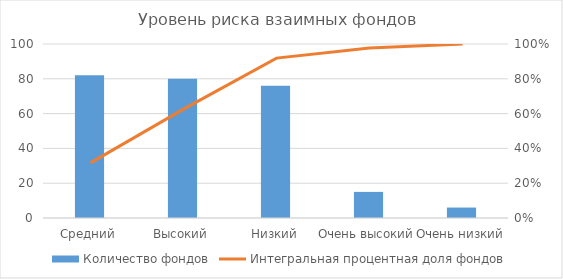
| Category | Количество фондов |
|---|---|
| Средний | 82 |
| Высокий | 80 |
| Низкий | 76 |
| Очень высокий | 15 |
| Очень низкий | 6 |